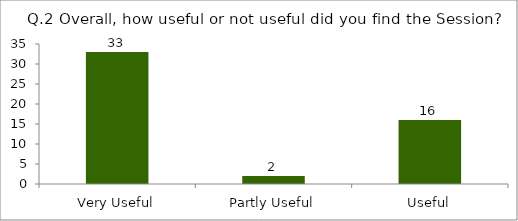
| Category | Q.2 Overall, how useful or not useful did you find the Session? |
|---|---|
| Very Useful | 33 |
| Partly Useful | 2 |
| Useful | 16 |